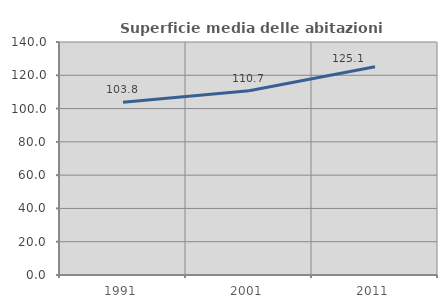
| Category | Superficie media delle abitazioni occupate |
|---|---|
| 1991.0 | 103.769 |
| 2001.0 | 110.71 |
| 2011.0 | 125.07 |